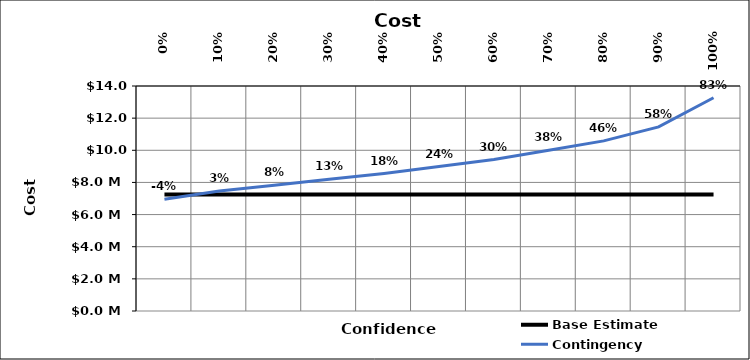
| Category | Base Estimate | Contingency |
|---|---|---|
| 0.0 | 7250000 | 6960000 |
| 0.1 | 7250000 | 7467500 |
| 0.2 | 7250000 | 7830000 |
| 0.3 | 7250000 | 8192500 |
| 0.4 | 7250000 | 8555000 |
| 0.5 | 7250000 | 8990000 |
| 0.6 | 7250000 | 9425000 |
| 0.7 | 7250000 | 10005000 |
| 0.8 | 7250000 | 10585000 |
| 0.9 | 7250000 | 11455000 |
| 1.0 | 7250000 | 13267500 |